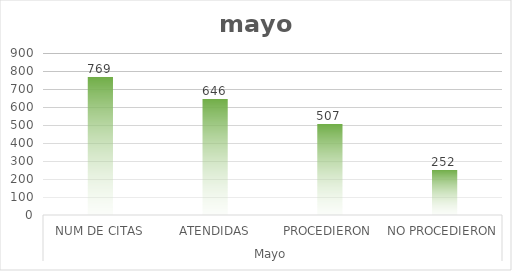
| Category | Series 0 |
|---|---|
| 0 | 769 |
| 1 | 646 |
| 2 | 507 |
| 3 | 252 |